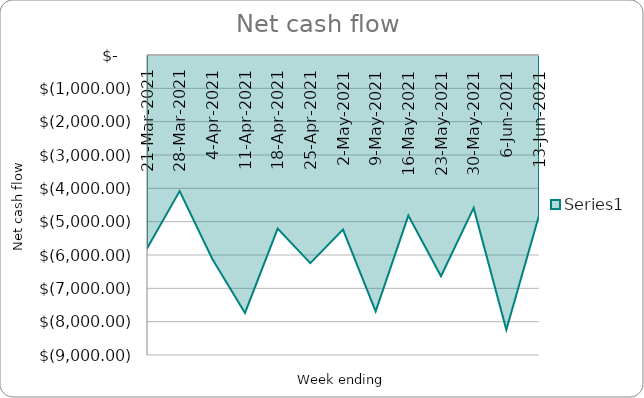
| Category | Series 0 |
|---|---|
| 2021-03-21 | -5802.651 |
| 2021-03-28 | -4083.788 |
| 2021-04-04 | -6117.971 |
| 2021-04-11 | -7737.788 |
| 2021-04-18 | -5209.121 |
| 2021-04-25 | -6243.788 |
| 2021-05-02 | -5239.121 |
| 2021-05-09 | -7689.788 |
| 2021-05-16 | -4817.121 |
| 2021-05-23 | -6635.788 |
| 2021-05-30 | -4587.121 |
| 2021-06-06 | -8239.788 |
| 2021-06-13 | -4817.121 |